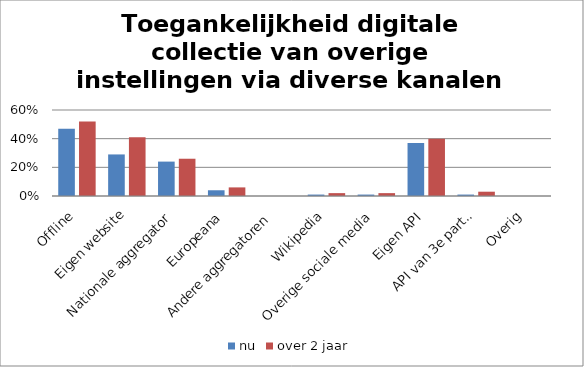
| Category | nu | over 2 jaar |
|---|---|---|
| Offline | 0.47 | 0.52 |
| Eigen website | 0.29 | 0.41 |
| Nationale aggregator | 0.24 | 0.26 |
| Europeana | 0.04 | 0.06 |
| Andere aggregatoren | 0 | 0 |
| Wikipedia | 0.01 | 0.02 |
| Overige sociale media | 0.01 | 0.02 |
| Eigen API | 0.37 | 0.4 |
| API van 3e partij | 0.01 | 0.03 |
| Overig | 0 | 0 |